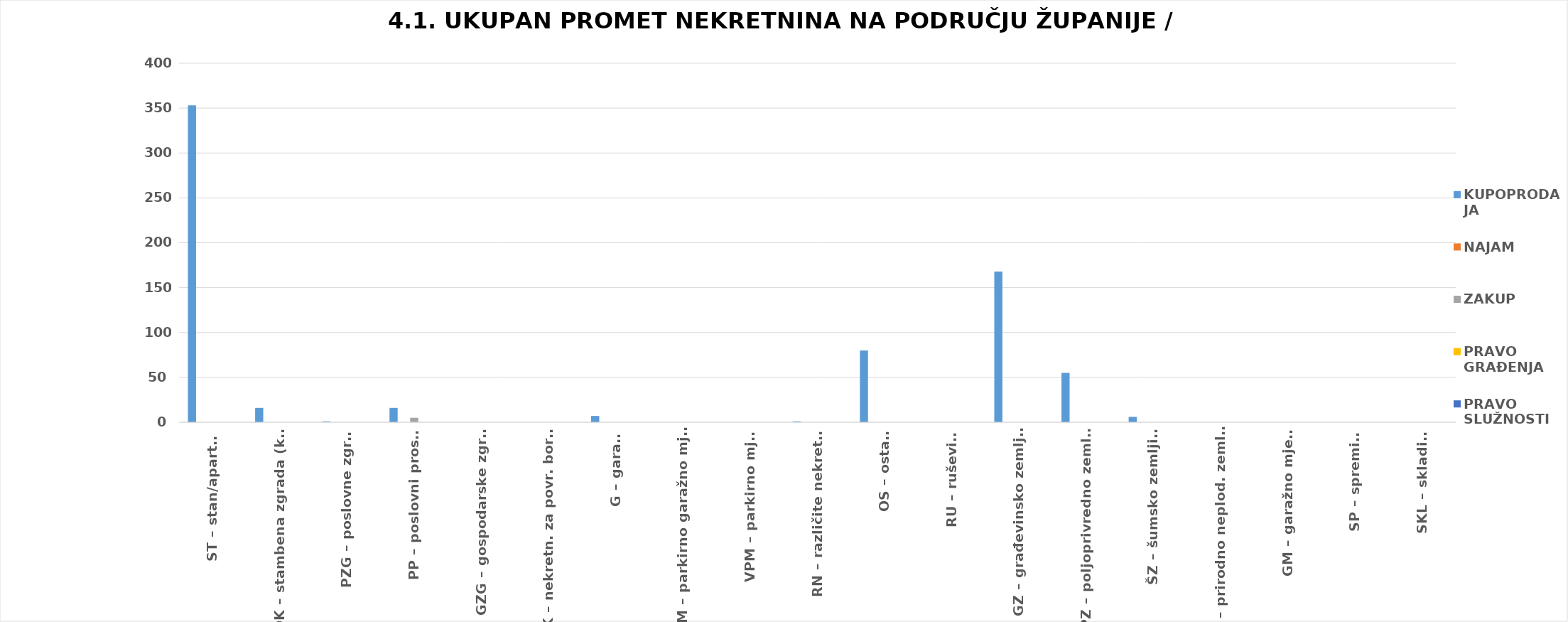
| Category | KUPOPRODAJA | NAJAM | ZAKUP | PRAVO GRAĐENJA | PRAVO SLUŽNOSTI |
|---|---|---|---|---|---|
| ST – stan/apartman | 353 | 0 | 0 | 0 | 0 |
| OK – stambena zgrada (kuća) | 16 | 0 | 0 | 0 | 0 |
| PZG – poslovne zgrade | 1 | 0 | 0 | 0 | 0 |
| PP – poslovni prostori | 16 | 0 | 5 | 0 | 0 |
| GZG – gospodarske zgrade | 0 | 0 | 0 | 0 | 0 |
| VIK – nekretn. za povr. boravak | 0 | 0 | 0 | 0 | 0 |
| G – garaža | 7 | 0 | 0 | 0 | 0 |
| PGM – parkirno garažno mjesto | 0 | 0 | 0 | 0 | 0 |
| VPM – parkirno mjesto | 0 | 0 | 0 | 0 | 0 |
| RN – različite nekretnine | 1 | 0 | 0 | 0 | 0 |
| OS – ostalo | 80 | 0 | 0 | 0 | 0 |
| RU – ruševine | 0 | 0 | 0 | 0 | 0 |
| GZ – građevinsko zemljište | 168 | 0 | 0 | 0 | 0 |
| PZ – poljoprivredno zemljište | 55 | 0 | 0 | 0 | 0 |
| ŠZ – šumsko zemljište | 6 | 0 | 0 | 0 | 0 |
| PNZ – prirodno neplod. zemljište | 0 | 0 | 0 | 0 | 0 |
| GM – garažno mjesto | 0 | 0 | 0 | 0 | 0 |
| SP – spremište | 0 | 0 | 0 | 0 | 0 |
| SKL – skladište | 0 | 0 | 0 | 0 | 0 |